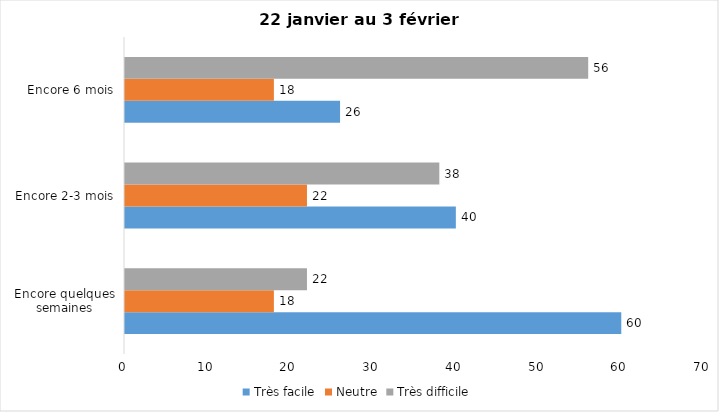
| Category | Très facile | Neutre | Très difficile |
|---|---|---|---|
| Encore quelques semaines | 60 | 18 | 22 |
| Encore 2-3 mois | 40 | 22 | 38 |
| Encore 6 mois | 26 | 18 | 56 |